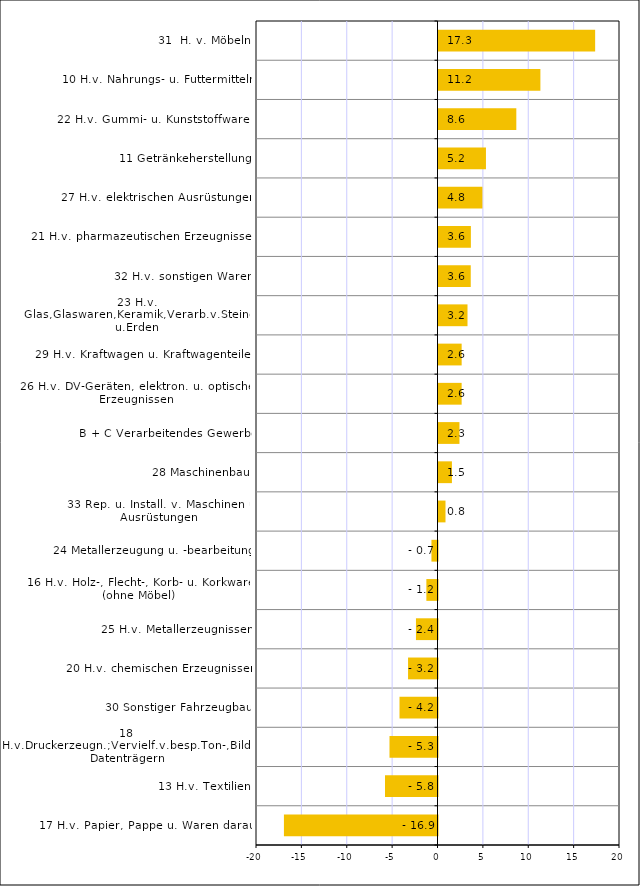
| Category | Series 0 |
|---|---|
| 17 H.v. Papier, Pappe u. Waren daraus | -16.923 |
| 13 H.v. Textilien | -5.785 |
| 18 H.v.Druckerzeugn.;Vervielf.v.besp.Ton-,Bild-u.Datenträgern | -5.29 |
| 30 Sonstiger Fahrzeugbau | -4.187 |
| 20 H.v. chemischen Erzeugnissen | -3.245 |
| 25 H.v. Metallerzeugnissen | -2.374 |
| 16 H.v. Holz-, Flecht-, Korb- u. Korkwaren (ohne Möbel) | -1.227 |
| 24 Metallerzeugung u. -bearbeitung | -0.668 |
| 33 Rep. u. Install. v. Maschinen u. Ausrüstungen | 0.771 |
| 28 Maschinenbau | 1.479 |
| B + C Verarbeitendes Gewerbe | 2.308 |
| 26 H.v. DV-Geräten, elektron. u. optischen Erzeugnissen | 2.55 |
| 29 H.v. Kraftwagen u. Kraftwagenteilen | 2.552 |
| 23 H.v. Glas,Glaswaren,Keramik,Verarb.v.Steinen u.Erden | 3.196 |
| 32 H.v. sonstigen Waren | 3.554 |
| 21 H.v. pharmazeutischen Erzeugnissen | 3.568 |
| 27 H.v. elektrischen Ausrüstungen | 4.838 |
| 11 Getränkeherstellung | 5.229 |
| 22 H.v. Gummi- u. Kunststoffwaren | 8.575 |
| 10 H.v. Nahrungs- u. Futtermitteln | 11.228 |
| 31  H. v. Möbeln | 17.261 |